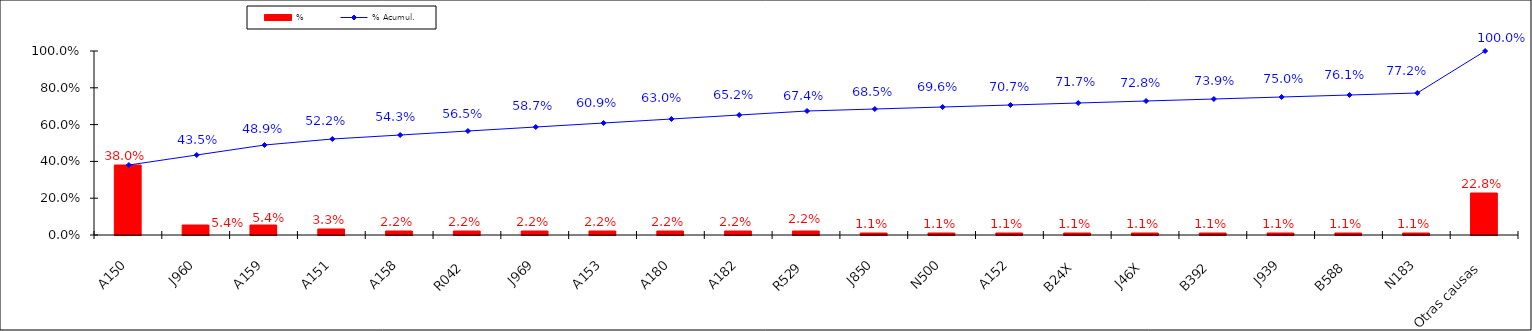
| Category | % |
|---|---|
| A150 | 0.38 |
| J960 | 0.054 |
| A159 | 0.054 |
| A151 | 0.033 |
| A158 | 0.022 |
| R042 | 0.022 |
| J969 | 0.022 |
| A153 | 0.022 |
| A180 | 0.022 |
| A182 | 0.022 |
| R529 | 0.022 |
| J850 | 0.011 |
| N500 | 0.011 |
| A152 | 0.011 |
| B24X | 0.011 |
| J46X | 0.011 |
| B392 | 0.011 |
| J939 | 0.011 |
| B588 | 0.011 |
| N183 | 0.011 |
| Otras causas | 0.228 |